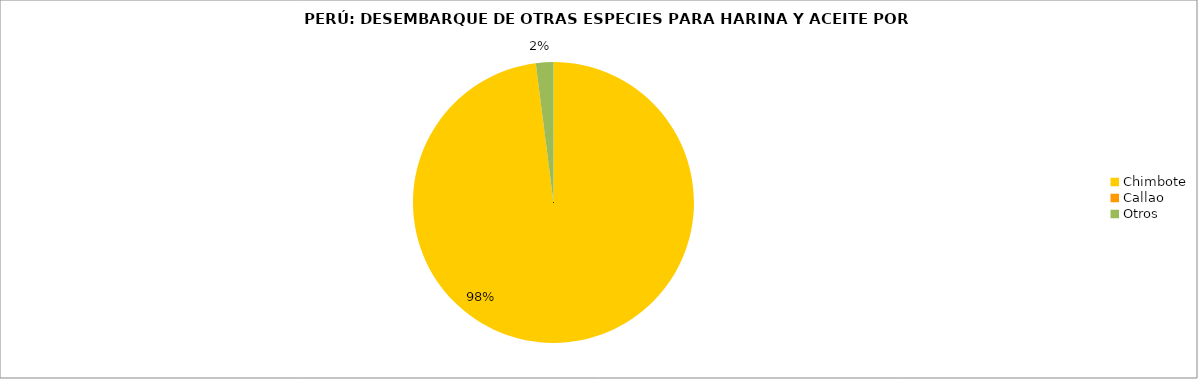
| Category | Series 0 |
|---|---|
| Chimbote | 636.701 |
| Callao | 0 |
| Otros | 13.102 |